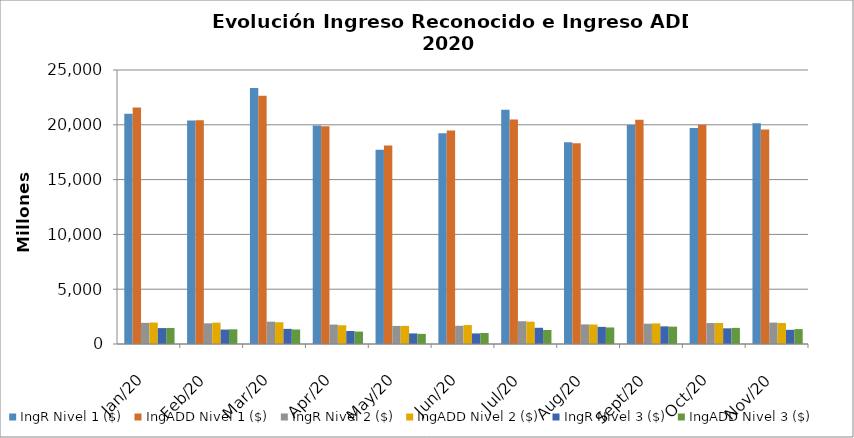
| Category | IngR Nivel 1 ($) | IngADD Nivel 1 ($) | IngR Nivel 2 ($) | IngADD Nivel 2 ($) | IngR Nivel 3 ($) | IngADD Nivel 3 ($) |
|---|---|---|---|---|---|---|
| 2020-01-01 | 21015817713 | 21567709468 | 1928833814 | 1959000384 | 1451692545 | 1463347367 |
| 2020-02-01 | 20398612419 | 20412710585 | 1887150229 | 1948255458 | 1318077938 | 1339864256 |
| 2020-03-01 | 23356248860 | 22655018766 | 2039541197 | 1983914865 | 1380354869 | 1323852185 |
| 2020-04-01 | 19944586766 | 19862337321 | 1773506460 | 1709146599 | 1187430965 | 1134674340 |
| 2020-05-01 | 17731040556 | 18110606218 | 1647508703 | 1651044124 | 964885112 | 924851863 |
| 2020-06-01 | 19218954031 | 19477149017 | 1661472174 | 1728159810 | 963726982 | 1005679789 |
| 2020-07-01 | 21369152607 | 20482653423 | 2080373897 | 2036232295 | 1479596386 | 1277739245 |
| 2020-08-01 | 18413202362 | 18312537082 | 1788676340 | 1776097132 | 1563692597 | 1511722630 |
| 2020-09-01 | 19977604594 | 20459554145 | 1853948204 | 1879220230 | 1609867526 | 1584093071 |
| 2020-10-01 | 19719398679 | 20004654350 | 1912890407 | 1914263178 | 1431030839 | 1470685104 |
| 2020-11-01 | 20140193103 | 19578319878 | 1954491338 | 1915160191 | 1292718771 | 1360109943 |